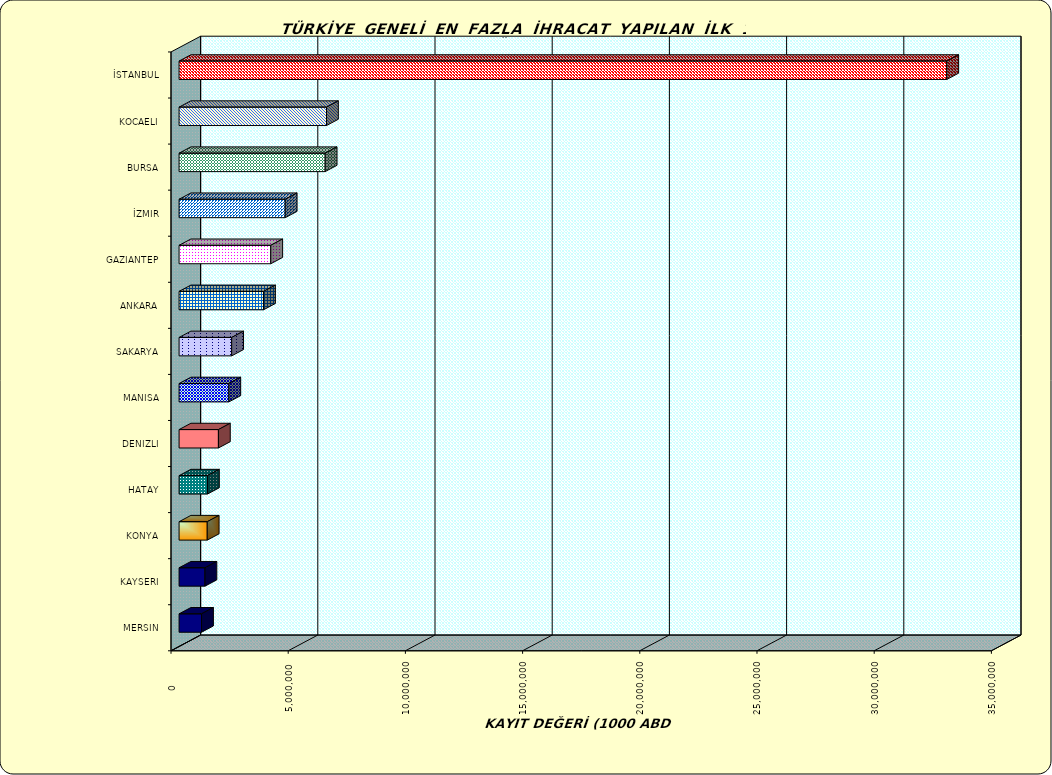
| Category | Series 0 |
|---|---|
| İSTANBUL | 32751740.436 |
| KOCAELI | 6289660.049 |
| BURSA | 6233396.991 |
| İZMIR | 4528360.2 |
| GAZIANTEP | 3911647.146 |
| ANKARA | 3603279.422 |
| SAKARYA | 2244354.663 |
| MANISA | 2122523.348 |
| DENIZLI | 1678367.467 |
| HATAY | 1211157.62 |
| KONYA | 1201269.946 |
| KAYSERI | 1104119.35 |
| MERSIN | 958021.671 |